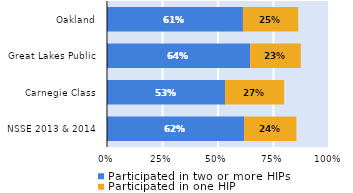
| Category | Participated in two or more HIPs | Participated in one HIP |
|---|---|---|
| NSSE 2013 & 2014 | 0.617 | 0.236 |
| Carnegie Class | 0.532 | 0.266 |
| Great Lakes Public | 0.645 | 0.228 |
| Oakland | 0.612 | 0.249 |